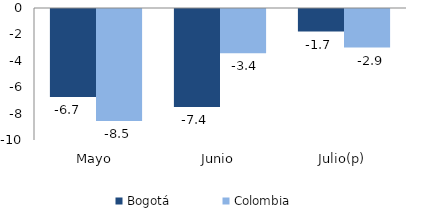
| Category | Bogotá | Colombia |
|---|---|---|
| Mayo | -6.664 | -8.482 |
| Junio | -7.42 | -3.357 |
| Julio(p) | -1.708 | -2.918 |